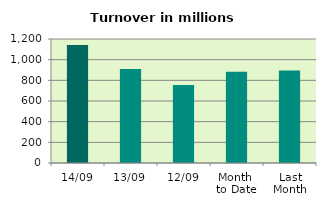
| Category | Series 0 |
|---|---|
| 14/09 | 1142.277 |
| 13/09 | 909.088 |
| 12/09 | 755.482 |
| Month 
to Date | 884.206 |
| Last
Month | 893.956 |